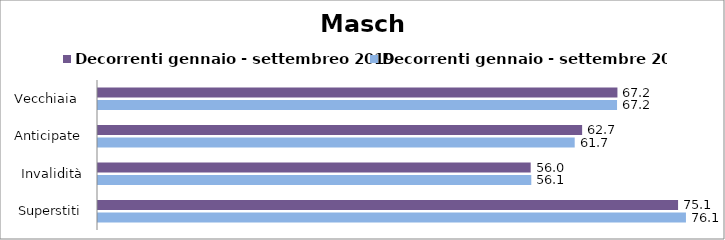
| Category | Decorrenti gennaio - settembreo 2019 | Decorrenti gennaio - settembre 2020 |
|---|---|---|
| Vecchiaia  | 67.24 | 67.19 |
|  Anticipate | 62.67 | 61.71 |
| Invalidità | 56.01 | 56.09 |
| Superstiti | 75.09 | 76.11 |